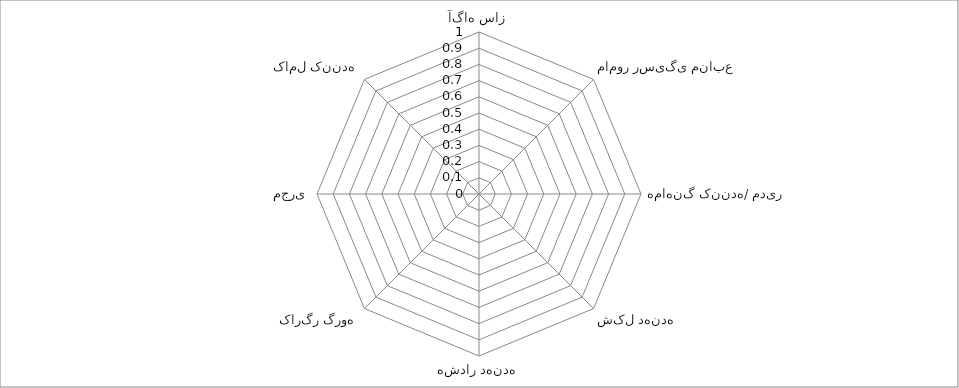
| Category | Series 0 |
|---|---|
| آگاه ساز | 0 |
| مامور رسیگی منابع | 0 |
| هماهنگ کننده/ مدیر | 0 |
| شکل دهنده | 0 |
| هشدار دهنده | 0 |
| کارگر گروه | 0 |
| مجری | 0 |
| کامل کننده | 0 |